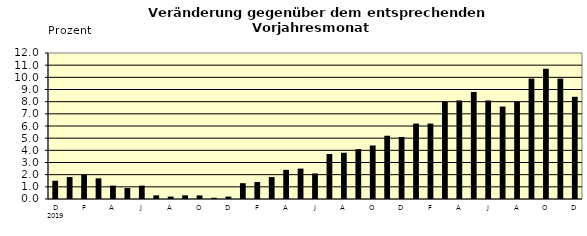
| Category | Series 0 |
|---|---|
| 0 | 1.5 |
| 1 | 1.8 |
| 2 | 2 |
| 3 | 1.7 |
| 4 | 1.1 |
| 5 | 0.9 |
| 6 | 1.1 |
| 7 | 0.3 |
| 8 | 0.2 |
| 9 | 0.3 |
| 10 | 0.3 |
| 11 | 0.1 |
| 12 | 0.2 |
| 13 | 1.3 |
| 14 | 1.4 |
| 15 | 1.8 |
| 16 | 2.4 |
| 17 | 2.5 |
| 18 | 2.1 |
| 19 | 3.7 |
| 20 | 3.8 |
| 21 | 4.1 |
| 22 | 4.4 |
| 23 | 5.2 |
| 24 | 5.1 |
| 25 | 6.2 |
| 26 | 6.2 |
| 27 | 8 |
| 28 | 8.1 |
| 29 | 8.8 |
| 30 | 8.1 |
| 31 | 7.6 |
| 32 | 8 |
| 33 | 9.9 |
| 34 | 10.7 |
| 35 | 9.9 |
| 36 | 8.4 |